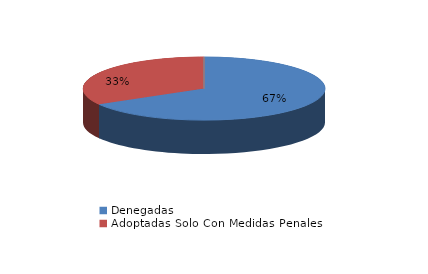
| Category | Series 0 |
|---|---|
| Denegadas | 2 |
| Adoptadas Solo Con Medidas Penales | 1 |
| Adoptadas Con Medidas Civiles Y Penales | 0 |
| Adoptadas Con Medidas Solo Civiles | 0 |